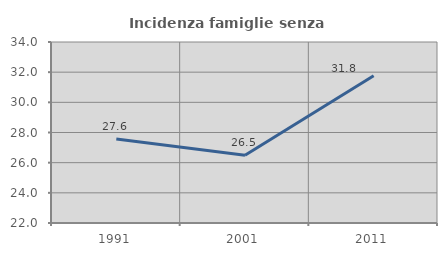
| Category | Incidenza famiglie senza nuclei |
|---|---|
| 1991.0 | 27.576 |
| 2001.0 | 26.488 |
| 2011.0 | 31.76 |